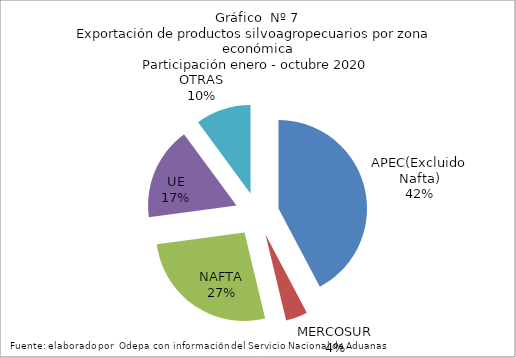
| Category | Series 0 |
|---|---|
| APEC(Excluido Nafta) | 5541756.152 |
| MERCOSUR | 522447.328 |
| NAFTA | 3493451.256 |
| UE | 2231209.747 |
| OTRAS | 1324307.518 |